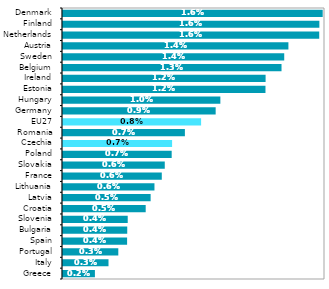
| Category | 2019 |
|---|---|
| Greece | 0.002 |
| Italy | 0.003 |
| Portugal | 0.003 |
| Spain | 0.004 |
| Bulgaria | 0.004 |
| Slovenia | 0.004 |
| Croatia | 0.005 |
| Latvia | 0.005 |
| Lithuania | 0.006 |
| France | 0.006 |
| Slovakia | 0.006 |
| Poland | 0.007 |
| Czechia | 0.007 |
| Romania | 0.007 |
| EU27 | 0.008 |
| Germany | 0.009 |
| Hungary | 0.01 |
| Estonia | 0.012 |
| Ireland | 0.012 |
| Belgium | 0.013 |
| Sweden | 0.014 |
| Austria | 0.014 |
| Netherlands | 0.016 |
| Finland | 0.016 |
| Denmark | 0.016 |